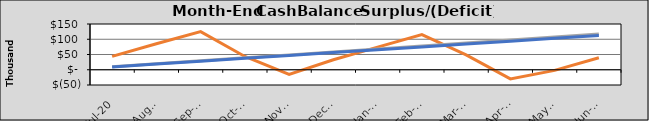
| Category | Final Cash | Original Cash | Revised Cash |
|---|---|---|---|
| 2020-07-01 | 43807.069 | 9746.34 | 9368.558 |
| 2020-08-01 | 85101.514 | 19492.031 | 18737.117 |
| 2020-09-01 | 124863.778 | 29237.723 | 28105.675 |
| 2020-10-02 | 43514.667 | 38983.415 | 37474.233 |
| 2020-11-02 | -15298.264 | 48729.107 | 46842.792 |
| 2020-12-03 | 32667.931 | 58474.798 | 56211.35 |
| 2021-01-03 | 74312.375 | 68220.49 | 65579.908 |
| 2021-02-03 | 115485.514 | 77966.182 | 74948.467 |
| 2021-03-06 | 48506.584 | 87711.874 | 84317.025 |
| 2021-04-06 | -29906.347 | 97457.565 | 93685.583 |
| 2021-05-07 | -2119.278 | 107203.257 | 103054.142 |
| 2021-06-07 | 39381.874 | 116948.949 | 112422.7 |